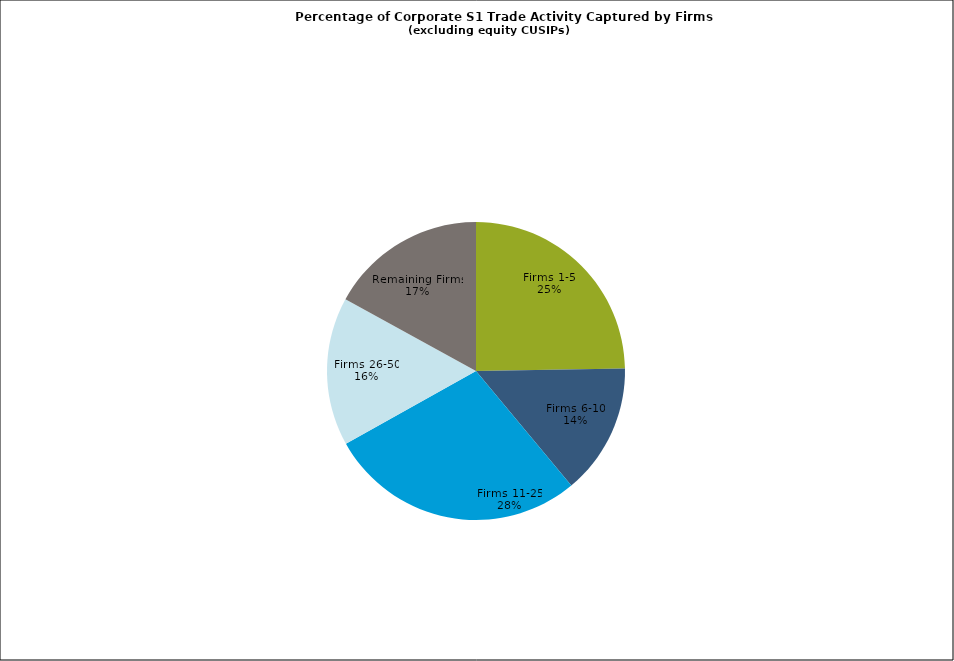
| Category | Series 0 |
|---|---|
| Firms 1-5 | 0.247 |
| Firms 6-10 | 0.142 |
| Firms 11-25 | 0.279 |
| Firms 26-50 | 0.161 |
| Remaining Firms | 0.17 |